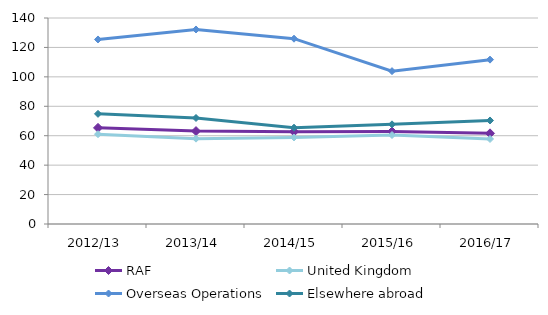
| Category | RAF | United Kingdom | Overseas Operations | Elsewhere abroad |
|---|---|---|---|---|
| 2012/13 | 65.335 | 61.023 | 125.416 | 74.862 |
| 2013/14 | 63.141 | 58.009 | 132.198 | 72.044 |
| 2014/15 | 62.704 | 58.802 | 125.936 | 65.447 |
| 2015/16 | 62.843 | 60.472 | 103.89 | 67.737 |
| 2016/17 | 61.611 | 57.77 | 111.703 | 70.358 |